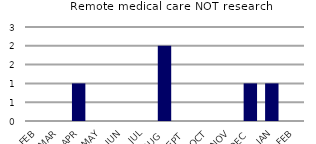
| Category | Remote medical care NOT research |
|---|---|
| FEB | 0 |
| MAR | 0 |
| APR | 1 |
| MAY | 0 |
| JUN | 0 |
| JUL | 0 |
| AUG | 2 |
| SEPT | 0 |
| OCT | 0 |
| NOV | 0 |
| DEC | 1 |
| JAN | 1 |
| FEB | 0 |